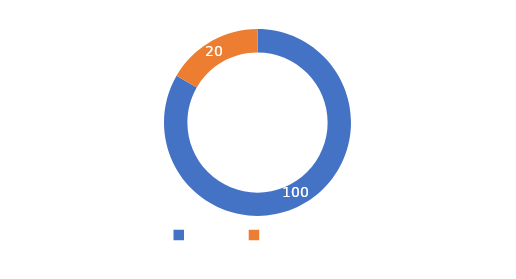
| Category | Series 0 |
|---|---|
| META  | 100 |
| CUMPLIMIENTO | 20 |